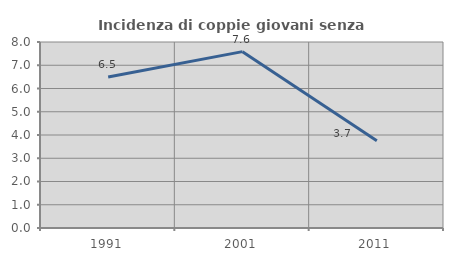
| Category | Incidenza di coppie giovani senza figli |
|---|---|
| 1991.0 | 6.491 |
| 2001.0 | 7.585 |
| 2011.0 | 3.749 |